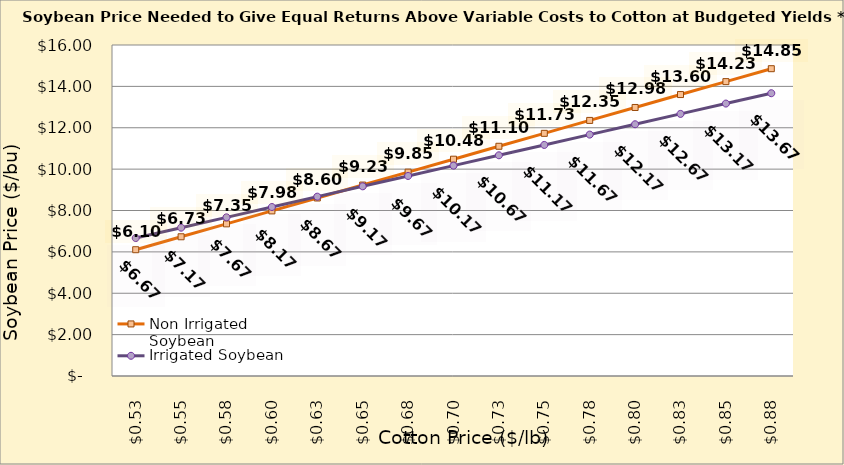
| Category | Non Irrigated Soybean | Irrigated Soybean |
|---|---|---|
| 0.5249999999999998 | 6.105 | 6.669 |
| 0.5499999999999998 | 6.73 | 7.169 |
| 0.5749999999999998 | 7.355 | 7.669 |
| 0.5999999999999999 | 7.98 | 8.169 |
| 0.6249999999999999 | 8.605 | 8.669 |
| 0.6499999999999999 | 9.23 | 9.169 |
| 0.6749999999999999 | 9.855 | 9.669 |
| 0.7 | 10.48 | 10.169 |
| 0.725 | 11.105 | 10.669 |
| 0.75 | 11.73 | 11.169 |
| 0.775 | 12.355 | 11.669 |
| 0.8 | 12.98 | 12.169 |
| 0.8250000000000001 | 13.605 | 12.669 |
| 0.8500000000000001 | 14.23 | 13.169 |
| 0.8750000000000001 | 14.855 | 13.669 |